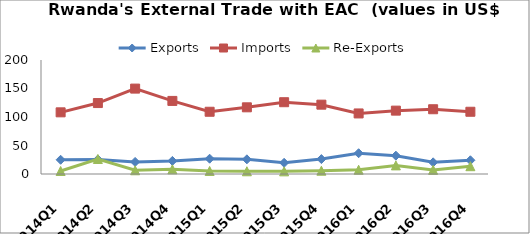
| Category | Exports | Imports | Re-Exports |
|---|---|---|---|
| 2014Q1 | 24.967 | 108.187 | 5.315 |
| 2014Q2 | 25.448 | 124.453 | 26.344 |
| 2014Q3 | 21.18 | 149.827 | 6.525 |
| 2014Q4 | 22.973 | 128.216 | 8.164 |
| 2015Q1 | 26.831 | 109.19 | 5.342 |
| 2015Q2 | 25.726 | 116.975 | 4.792 |
| 2015Q3 | 19.654 | 125.948 | 4.643 |
| 2015Q4 | 26.132 | 121.64 | 5.76 |
| 2016Q1 | 36.445 | 106.236 | 7.434 |
| 2016Q2 | 32.158 | 111.171 | 15.106 |
| 2016Q3 | 20.45 | 113.623 | 7.24 |
| 2016Q4 | 24.092 | 109.185 | 13.685 |